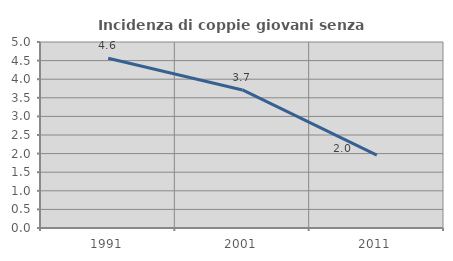
| Category | Incidenza di coppie giovani senza figli |
|---|---|
| 1991.0 | 4.564 |
| 2001.0 | 3.711 |
| 2011.0 | 1.96 |